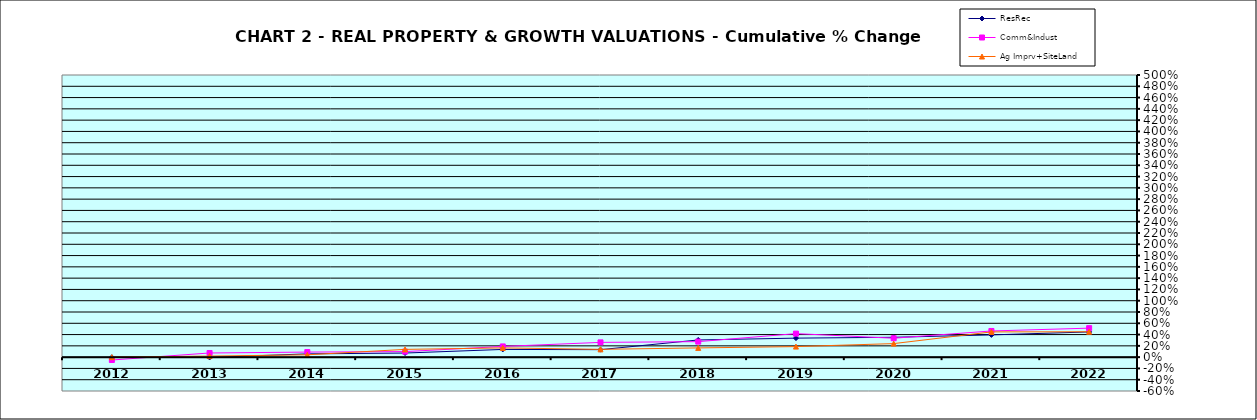
| Category | ResRec | Comm&Indust | Ag Imprv+SiteLand |
|---|---|---|---|
| 2012.0 | -0.002 | -0.051 | 0 |
| 2013.0 | -0.005 | 0.073 | 0.019 |
| 2014.0 | 0.058 | 0.089 | 0.042 |
| 2015.0 | 0.073 | 0.098 | 0.137 |
| 2016.0 | 0.137 | 0.19 | 0.164 |
| 2017.0 | 0.133 | 0.262 | 0.138 |
| 2018.0 | 0.305 | 0.275 | 0.164 |
| 2019.0 | 0.337 | 0.417 | 0.187 |
| 2020.0 | 0.352 | 0.335 | 0.24 |
| 2021.0 | 0.394 | 0.464 | 0.448 |
| 2022.0 | 0.447 | 0.514 | 0.45 |